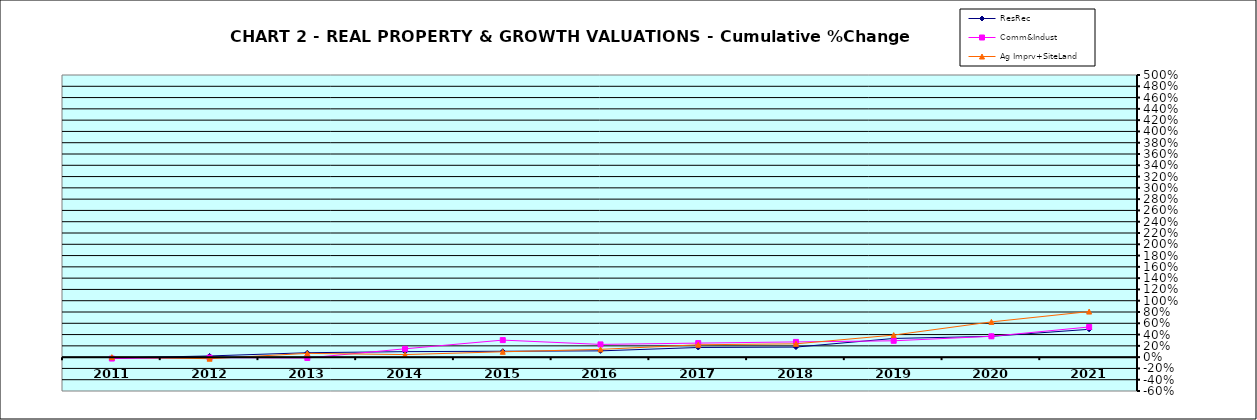
| Category | ResRec | Comm&Indust | Ag Imprv+SiteLand |
|---|---|---|---|
| 2011.0 | -0.016 | -0.025 | 0 |
| 2012.0 | 0.021 | -0.009 | -0.028 |
| 2013.0 | 0.078 | -0.015 | 0.067 |
| 2014.0 | 0.097 | 0.148 | 0.045 |
| 2015.0 | 0.105 | 0.302 | 0.095 |
| 2016.0 | 0.111 | 0.226 | 0.138 |
| 2017.0 | 0.171 | 0.249 | 0.219 |
| 2018.0 | 0.178 | 0.27 | 0.236 |
| 2019.0 | 0.331 | 0.29 | 0.391 |
| 2020.0 | 0.369 | 0.369 | 0.625 |
| 2021.0 | 0.493 | 0.535 | 0.808 |